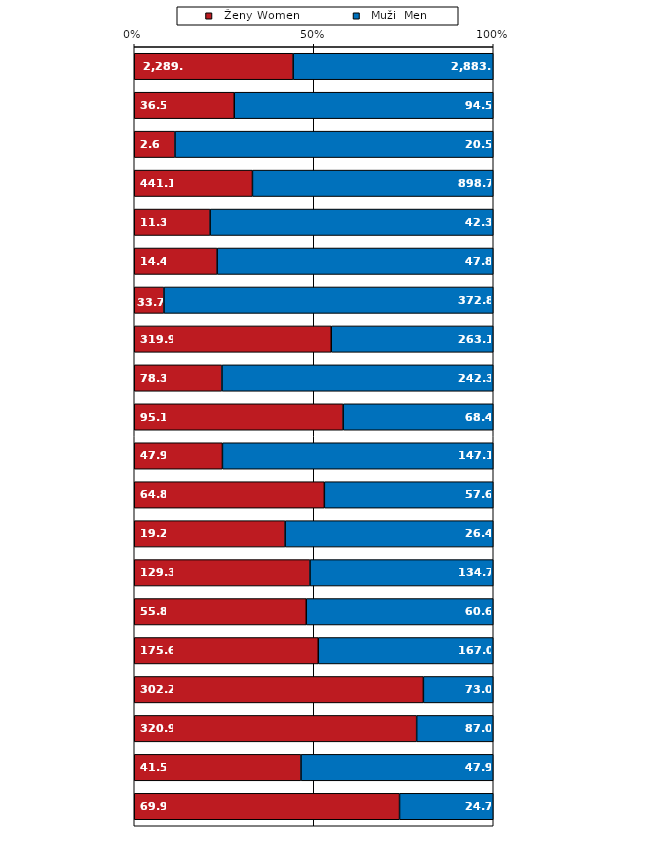
| Category |   Ženy Women |   Muži  Men |
|---|---|---|
| Zemědělství, lesnictví 
  a rybářství | 2289.923 | 2883.558 |
| Těžba a dobývání | 36.464 | 94.455 |
| Zpracovatelský průmysl | 2.619 | 20.461 |
| Výroba a rozvod elektřiny
  plynu, tepla a 
  klimatizovaného vzduchu | 441.083 | 898.711 |
| Zásobování vodou,
  činnosti souv. s 
  odpadními vodami,
  odpady a sanacemi
   elektřiny, plynu a 
   vody | 11.339 | 42.312 |
| Stavebnictví | 14.362 | 47.839 |
| Velkoobchod a
  maloobchod; opravy
  a údržba motorových
  vozidel | 33.66 | 372.848 |
| Doprava a skladování | 319.939 | 263.087 |
| Ubytování, stravování
  a pohostinství | 78.328 | 242.269 |
| Informační a komunikační
  činnosti | 95.136 | 68.359 |
| Peněžnictví a
  pojišťovnictví | 47.911 | 147.131 |
| Činnosti v oblasti
  nemovitostí | 64.778 | 57.557 |
| Profesní, vědecké
  a technické činosti | 19.167 | 26.445 |
| Administrativní a
  podpůrné činnosti | 129.263 | 134.746 |
| Veřejná správa a obrana;
  povinné sociální
  zabezpečení | 55.793 | 60.645 |
| Vzdělávání | 175.634 | 167.002 |
| Zdravotní a sociální péče
  | 302.176 | 73.018 |
| Kulturní, zábavní
  a rekreační činnosti | 320.905 | 87.015 |
| Ostatní činnosti | 41.515 | 47.856 |